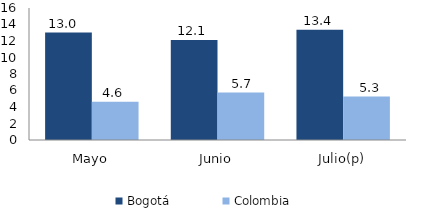
| Category | Bogotá | Colombia |
|---|---|---|
| Mayo | 13.02 | 4.632 |
| Junio | 12.109 | 5.746 |
| Julio(p) | 13.377 | 5.261 |